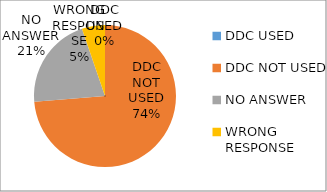
| Category | Series 0 |
|---|---|
| DDC USED | 0 |
| DDC NOT USED | 0.737 |
| NO ANSWER | 0.211 |
| WRONG RESPONSE | 0.053 |